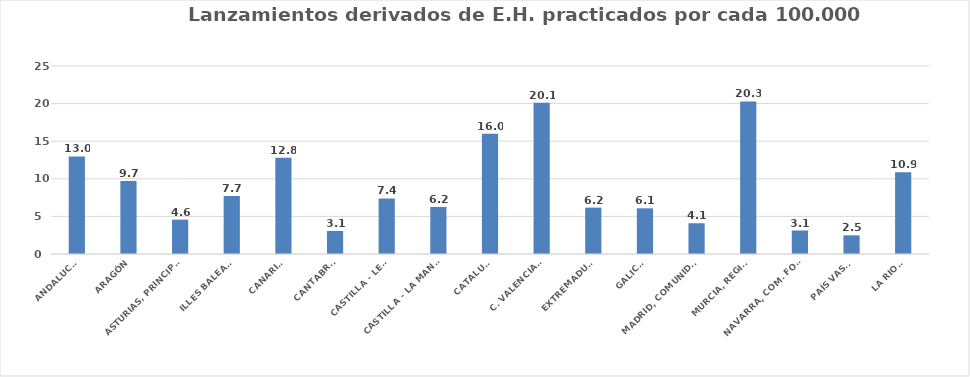
| Category | Series 0 |
|---|---|
| ANDALUCÍA | 12.979 |
| ARAGÓN | 9.709 |
| ASTURIAS, PRINCIPADO | 4.57 |
| ILLES BALEARS | 7.707 |
| CANARIAS | 12.789 |
| CANTABRIA | 3.058 |
| CASTILLA - LEÓN | 7.387 |
| CASTILLA - LA MANCHA | 6.248 |
| CATALUÑA | 16.002 |
| C. VALENCIANA | 20.102 |
| EXTREMADURA | 6.165 |
| GALICIA | 6.075 |
| MADRID, COMUNIDAD | 4.088 |
| MURCIA, REGIÓN | 20.287 |
| NAVARRA, COM. FORAL | 3.124 |
| PAÍS VASCO | 2.478 |
| LA RIOJA | 10.861 |